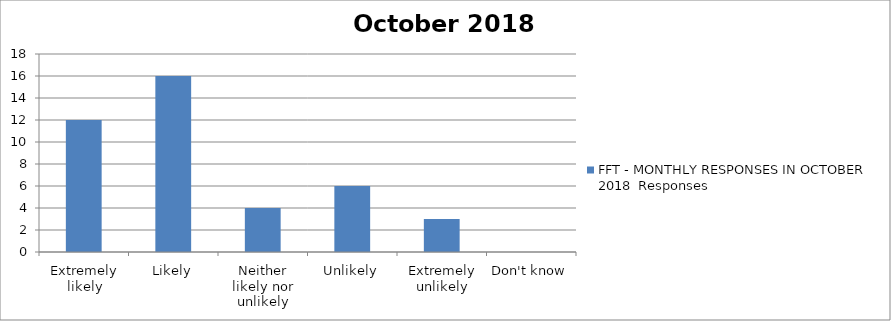
| Category | FFT - MONTHLY RESPONSES IN OCTOBER 2018 |
|---|---|
| Extremely likely | 12 |
| Likely | 16 |
| Neither likely nor unlikely | 4 |
| Unlikely | 6 |
| Extremely unlikely | 3 |
| Don't know | 0 |